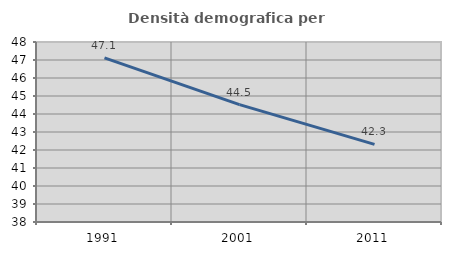
| Category | Densità demografica |
|---|---|
| 1991.0 | 47.117 |
| 2001.0 | 44.519 |
| 2011.0 | 42.313 |